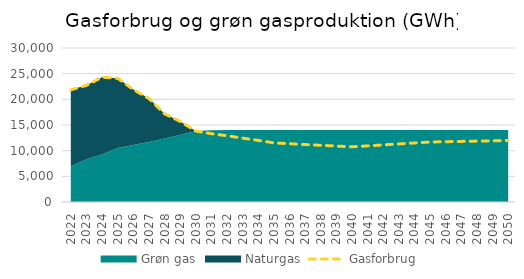
| Category | Gasforbrug |
|---|---|
| 0 | 21854.377 |
| 1 | 22726.154 |
| 2 | 24306.27 |
| 3 | 24110.587 |
| 4 | 21911.432 |
| 5 | 20155.417 |
| 6 | 17184.872 |
| 7 | 15700.867 |
| 8 | 13822.472 |
| 9 | 13310.104 |
| 10 | 12912.566 |
| 11 | 12440.468 |
| 12 | 12005.44 |
| 13 | 11521.422 |
| 14 | 11354.482 |
| 15 | 11191.273 |
| 16 | 11047.093 |
| 17 | 10900.034 |
| 18 | 10751.854 |
| 19 | 10930.35 |
| 20 | 11127.785 |
| 21 | 11311.63 |
| 22 | 11502.316 |
| 23 | 11685.871 |
| 24 | 11747.503 |
| 25 | 11805.845 |
| 26 | 11865.667 |
| 27 | 11920.978 |
| 28 | 11979.46 |